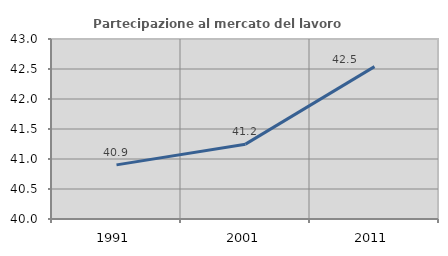
| Category | Partecipazione al mercato del lavoro  femminile |
|---|---|
| 1991.0 | 40.902 |
| 2001.0 | 41.247 |
| 2011.0 | 42.539 |